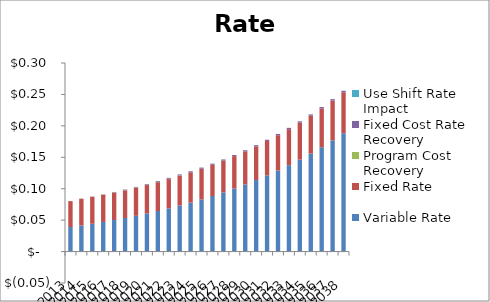
| Category | Variable Rate | Fixed Rate | Program Cost Recovery | Fixed Cost Rate Recovery | Use Shift Rate Impact |
|---|---|---|---|---|---|
| 2013.0 | 0.039 | 0.041 | 0 | 0 | 0 |
| 2014.0 | 0.042 | 0.042 | 0 | 0 | 0 |
| 2015.0 | 0.044 | 0.043 | 0 | 0 | 0 |
| 2016.0 | 0.047 | 0.043 | 0 | 0 | 0 |
| 2017.0 | 0.05 | 0.044 | 0 | 0.001 | 0 |
| 2018.0 | 0.053 | 0.044 | 0 | 0.001 | 0 |
| 2019.0 | 0.057 | 0.045 | 0 | 0.001 | 0 |
| 2020.0 | 0.061 | 0.045 | 0 | 0.001 | 0 |
| 2021.0 | 0.065 | 0.046 | 0 | 0.001 | 0 |
| 2022.0 | 0.069 | 0.047 | 0 | 0.001 | -0.001 |
| 2023.0 | 0.073 | 0.047 | 0 | 0.002 | -0.001 |
| 2024.0 | 0.078 | 0.048 | 0 | 0.002 | 0 |
| 2025.0 | 0.083 | 0.049 | 0 | 0.002 | 0 |
| 2026.0 | 0.088 | 0.05 | 0 | 0.002 | 0 |
| 2027.0 | 0.094 | 0.051 | 0 | 0.002 | 0 |
| 2028.0 | 0.1 | 0.052 | 0 | 0.002 | 0 |
| 2029.0 | 0.107 | 0.053 | 0 | 0.002 | 0 |
| 2030.0 | 0.114 | 0.054 | 0 | 0.002 | 0 |
| 2031.0 | 0.121 | 0.055 | 0 | 0.002 | 0 |
| 2032.0 | 0.129 | 0.056 | 0 | 0.002 | 0 |
| 2033.0 | 0.137 | 0.057 | 0 | 0.002 | 0 |
| 2034.0 | 0.146 | 0.059 | 0 | 0.002 | 0 |
| 2035.0 | 0.156 | 0.06 | 0 | 0.002 | 0 |
| 2036.0 | 0.166 | 0.062 | 0 | 0.002 | 0 |
| 2037.0 | 0.177 | 0.063 | 0 | 0.002 | 0 |
| 2038.0 | 0.188 | 0.065 | 0 | 0.002 | 0 |